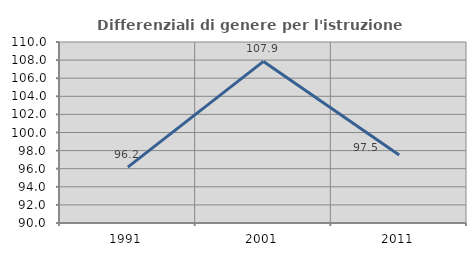
| Category | Differenziali di genere per l'istruzione superiore |
|---|---|
| 1991.0 | 96.169 |
| 2001.0 | 107.854 |
| 2011.0 | 97.518 |